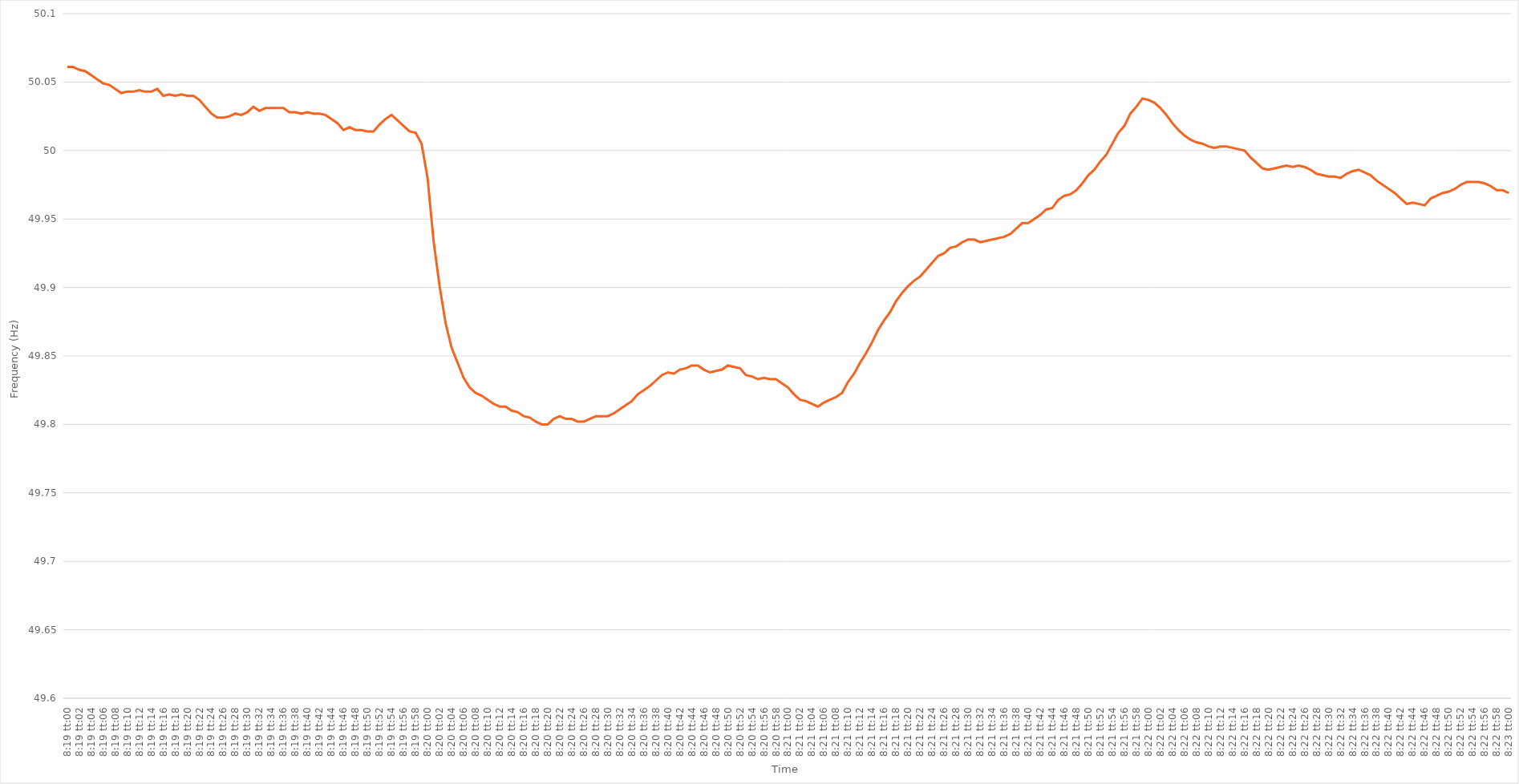
| Category | Series 0 |
|---|---|
| 0.34652777777777777 | 50.061 |
| 0.34653935185185186 | 50.061 |
| 0.3465509259259259 | 50.059 |
| 0.34656250000000005 | 50.058 |
| 0.3465740740740741 | 50.055 |
| 0.3465856481481482 | 50.052 |
| 0.3465972222222222 | 50.049 |
| 0.34660879629629626 | 50.048 |
| 0.34662037037037036 | 50.045 |
| 0.3466319444444444 | 50.042 |
| 0.34664351851851855 | 50.043 |
| 0.3466550925925926 | 50.043 |
| 0.3466666666666667 | 50.044 |
| 0.3466782407407407 | 50.043 |
| 0.3466898148148148 | 50.043 |
| 0.34670138888888885 | 50.045 |
| 0.346712962962963 | 50.04 |
| 0.34672453703703704 | 50.041 |
| 0.34673611111111113 | 50.04 |
| 0.3467476851851852 | 50.041 |
| 0.34675925925925927 | 50.04 |
| 0.3467708333333333 | 50.04 |
| 0.34678240740740746 | 50.037 |
| 0.3467939814814815 | 50.032 |
| 0.3468055555555556 | 50.027 |
| 0.34681712962962963 | 50.024 |
| 0.34682870370370367 | 50.024 |
| 0.34684027777777776 | 50.025 |
| 0.3468518518518518 | 50.027 |
| 0.34686342592592595 | 50.026 |
| 0.346875 | 50.028 |
| 0.3468865740740741 | 50.032 |
| 0.3468981481481481 | 50.029 |
| 0.3469097222222222 | 50.031 |
| 0.34692129629629626 | 50.031 |
| 0.3469328703703704 | 50.031 |
| 0.34694444444444444 | 50.031 |
| 0.34695601851851854 | 50.028 |
| 0.3469675925925926 | 50.028 |
| 0.34697916666666667 | 50.027 |
| 0.3469907407407407 | 50.028 |
| 0.34700231481481486 | 50.027 |
| 0.3470138888888889 | 50.027 |
| 0.347025462962963 | 50.026 |
| 0.34703703703703703 | 50.023 |
| 0.3470486111111111 | 50.02 |
| 0.34706018518518517 | 50.015 |
| 0.3470717592592593 | 50.017 |
| 0.34708333333333335 | 50.015 |
| 0.3470949074074074 | 50.015 |
| 0.3471064814814815 | 50.014 |
| 0.3471180555555555 | 50.014 |
| 0.3471296296296296 | 50.019 |
| 0.34714120370370366 | 50.023 |
| 0.3471527777777778 | 50.026 |
| 0.34716435185185185 | 50.022 |
| 0.34717592592592594 | 50.018 |
| 0.3471875 | 50.014 |
| 0.3471990740740741 | 50.013 |
| 0.3472106481481481 | 50.005 |
| 0.34722222222222227 | 49.98 |
| 0.3472337962962963 | 49.934 |
| 0.3472453703703704 | 49.901 |
| 0.34725694444444444 | 49.874 |
| 0.34726851851851853 | 49.856 |
| 0.34728009259259257 | 49.845 |
| 0.3472916666666667 | 49.834 |
| 0.34730324074074076 | 49.827 |
| 0.3473148148148148 | 49.823 |
| 0.3473263888888889 | 49.821 |
| 0.34733796296296293 | 49.818 |
| 0.347349537037037 | 49.815 |
| 0.34736111111111106 | 49.813 |
| 0.3473726851851852 | 49.813 |
| 0.34738425925925925 | 49.81 |
| 0.34739583333333335 | 49.809 |
| 0.3474074074074074 | 49.806 |
| 0.3474189814814815 | 49.805 |
| 0.3474305555555555 | 49.802 |
| 0.34744212962962967 | 49.8 |
| 0.3474537037037037 | 49.8 |
| 0.3474652777777778 | 49.804 |
| 0.34747685185185184 | 49.806 |
| 0.34748842592592594 | 49.804 |
| 0.3475 | 49.804 |
| 0.3475115740740741 | 49.802 |
| 0.34752314814814816 | 49.802 |
| 0.3475347222222222 | 49.804 |
| 0.3475462962962963 | 49.806 |
| 0.34755787037037034 | 49.806 |
| 0.34756944444444443 | 49.806 |
| 0.34758101851851847 | 49.808 |
| 0.3475925925925926 | 49.811 |
| 0.34760416666666666 | 49.814 |
| 0.34761574074074075 | 49.817 |
| 0.3476273148148148 | 49.822 |
| 0.3476388888888889 | 49.825 |
| 0.3476504629629629 | 49.828 |
| 0.3476620370370371 | 49.832 |
| 0.3476736111111111 | 49.836 |
| 0.3476851851851852 | 49.838 |
| 0.34769675925925925 | 49.837 |
| 0.34770833333333334 | 49.84 |
| 0.3477199074074074 | 49.841 |
| 0.34773148148148153 | 49.843 |
| 0.34774305555555557 | 49.843 |
| 0.34775462962962966 | 49.84 |
| 0.3477662037037037 | 49.838 |
| 0.3477777777777778 | 49.839 |
| 0.34778935185185184 | 49.84 |
| 0.3478009259259259 | 49.843 |
| 0.3478125 | 49.842 |
| 0.34782407407407406 | 49.841 |
| 0.34783564814814816 | 49.836 |
| 0.3478472222222222 | 49.835 |
| 0.3478587962962963 | 49.833 |
| 0.34787037037037033 | 49.834 |
| 0.3478819444444445 | 49.833 |
| 0.3478935185185185 | 49.833 |
| 0.3479050925925926 | 49.83 |
| 0.34791666666666665 | 49.827 |
| 0.34792824074074075 | 49.822 |
| 0.3479398148148148 | 49.818 |
| 0.34795138888888894 | 49.817 |
| 0.347962962962963 | 49.815 |
| 0.34797453703703707 | 49.813 |
| 0.3479861111111111 | 49.816 |
| 0.3479976851851852 | 49.818 |
| 0.34800925925925924 | 49.82 |
| 0.3480208333333333 | 49.823 |
| 0.34803240740740743 | 49.831 |
| 0.34804398148148147 | 49.837 |
| 0.34805555555555556 | 49.845 |
| 0.3480671296296296 | 49.852 |
| 0.3480787037037037 | 49.86 |
| 0.34809027777777773 | 49.869 |
| 0.3481018518518519 | 49.876 |
| 0.3481134259259259 | 49.882 |
| 0.348125 | 49.89 |
| 0.34813657407407406 | 49.896 |
| 0.34814814814814815 | 49.901 |
| 0.3481597222222222 | 49.905 |
| 0.34817129629629634 | 49.908 |
| 0.3481828703703704 | 49.913 |
| 0.3481944444444445 | 49.918 |
| 0.3482060185185185 | 49.923 |
| 0.3482175925925926 | 49.925 |
| 0.34822916666666665 | 49.929 |
| 0.3482407407407407 | 49.93 |
| 0.34825231481481483 | 49.933 |
| 0.3482638888888889 | 49.935 |
| 0.34827546296296297 | 49.935 |
| 0.348287037037037 | 49.933 |
| 0.3482986111111111 | 49.934 |
| 0.34831018518518514 | 49.935 |
| 0.3483217592592593 | 49.936 |
| 0.34833333333333333 | 49.937 |
| 0.3483449074074074 | 49.939 |
| 0.34835648148148146 | 49.943 |
| 0.34836805555555556 | 49.947 |
| 0.3483796296296296 | 49.947 |
| 0.34839120370370374 | 49.95 |
| 0.3484027777777778 | 49.953 |
| 0.3484143518518519 | 49.957 |
| 0.3484259259259259 | 49.958 |
| 0.3484375 | 49.964 |
| 0.34844907407407405 | 49.967 |
| 0.3484606481481482 | 49.968 |
| 0.34847222222222224 | 49.971 |
| 0.34848379629629633 | 49.976 |
| 0.34849537037037037 | 49.982 |
| 0.3485069444444444 | 49.986 |
| 0.3485185185185185 | 49.992 |
| 0.34853009259259254 | 49.997 |
| 0.3485416666666667 | 50.005 |
| 0.34855324074074073 | 50.013 |
| 0.3485648148148148 | 50.018 |
| 0.34857638888888887 | 50.027 |
| 0.34858796296296296 | 50.032 |
| 0.348599537037037 | 50.038 |
| 0.34861111111111115 | 50.037 |
| 0.3486226851851852 | 50.035 |
| 0.3486342592592593 | 50.031 |
| 0.3486458333333333 | 50.026 |
| 0.3486574074074074 | 50.02 |
| 0.34866898148148145 | 50.015 |
| 0.3486805555555556 | 50.011 |
| 0.34869212962962964 | 50.008 |
| 0.34870370370370374 | 50.006 |
| 0.3487152777777778 | 50.005 |
| 0.3487268518518518 | 50.003 |
| 0.3487384259259259 | 50.002 |
| 0.34874999999999995 | 50.003 |
| 0.3487615740740741 | 50.003 |
| 0.34877314814814814 | 50.002 |
| 0.34878472222222223 | 50.001 |
| 0.34879629629629627 | 50 |
| 0.34880787037037037 | 49.995 |
| 0.3488194444444444 | 49.991 |
| 0.34883101851851855 | 49.987 |
| 0.3488425925925926 | 49.986 |
| 0.3488541666666667 | 49.987 |
| 0.3488657407407407 | 49.988 |
| 0.3488773148148148 | 49.989 |
| 0.34888888888888886 | 49.988 |
| 0.348900462962963 | 49.989 |
| 0.34891203703703705 | 49.988 |
| 0.34892361111111114 | 49.986 |
| 0.3489351851851852 | 49.983 |
| 0.3489467592592593 | 49.982 |
| 0.3489583333333333 | 49.981 |
| 0.34896990740740735 | 49.981 |
| 0.3489814814814815 | 49.98 |
| 0.34899305555555554 | 49.983 |
| 0.34900462962962964 | 49.985 |
| 0.3490162037037037 | 49.986 |
| 0.34902777777777777 | 49.984 |
| 0.3490393518518518 | 49.982 |
| 0.34905092592592596 | 49.978 |
| 0.3490625 | 49.975 |
| 0.3490740740740741 | 49.972 |
| 0.34908564814814813 | 49.969 |
| 0.3490972222222222 | 49.965 |
| 0.34910879629629626 | 49.961 |
| 0.3491203703703704 | 49.962 |
| 0.34913194444444445 | 49.961 |
| 0.34914351851851855 | 49.96 |
| 0.3491550925925926 | 49.965 |
| 0.3491666666666667 | 49.967 |
| 0.3491782407407407 | 49.969 |
| 0.34918981481481487 | 49.97 |
| 0.3492013888888889 | 49.972 |
| 0.34921296296296295 | 49.975 |
| 0.34922453703703704 | 49.977 |
| 0.3492361111111111 | 49.977 |
| 0.3492476851851852 | 49.977 |
| 0.3492592592592592 | 49.976 |
| 0.34927083333333336 | 49.974 |
| 0.3492824074074074 | 49.971 |
| 0.3492939814814815 | 49.971 |
| 0.34930555555555554 | 49.969 |